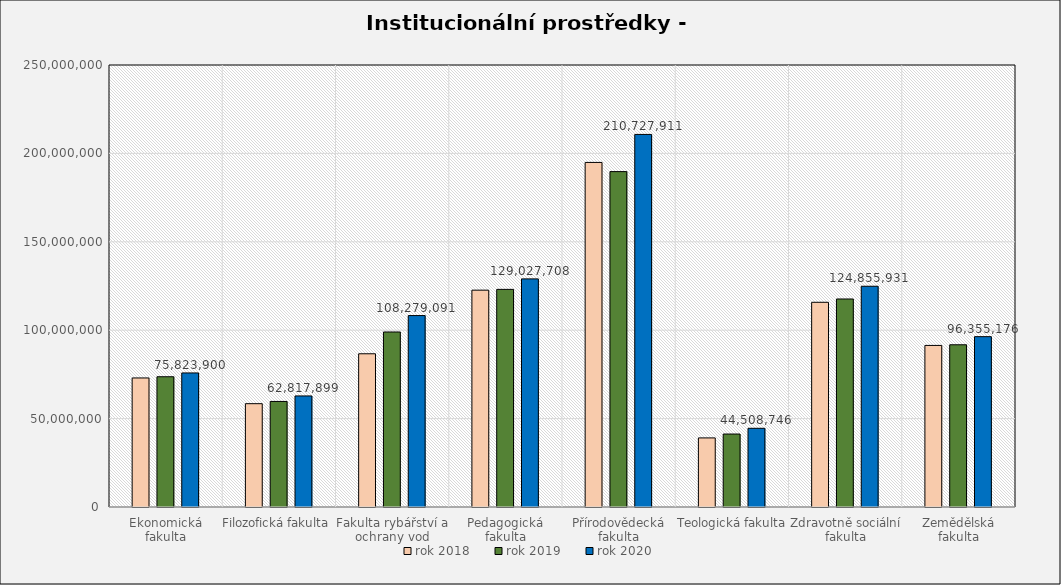
| Category | rok 2018 | rok 2019 | rok 2020 |
|---|---|---|---|
| Ekonomická fakulta | 72986482 | 73671227 | 75823899.67 |
| Filozofická fakulta | 58437728 | 59704375 | 62817898.714 |
| Fakulta rybářství a ochrany vod | 86666544 | 98986568 | 108279090.644 |
| Pedagogická fakulta | 122644576 | 123088365 | 129027708.287 |
| Přírodovědecká fakulta | 194889640 | 189693042 | 210727910.626 |
| Teologická fakulta | 39073688 | 41265899 | 44508746.198 |
| Zdravotně sociální fakulta | 115783919 | 117651532 | 124855930.537 |
| Zemědělská fakulta | 91385251 | 91755554 | 96355175.599 |